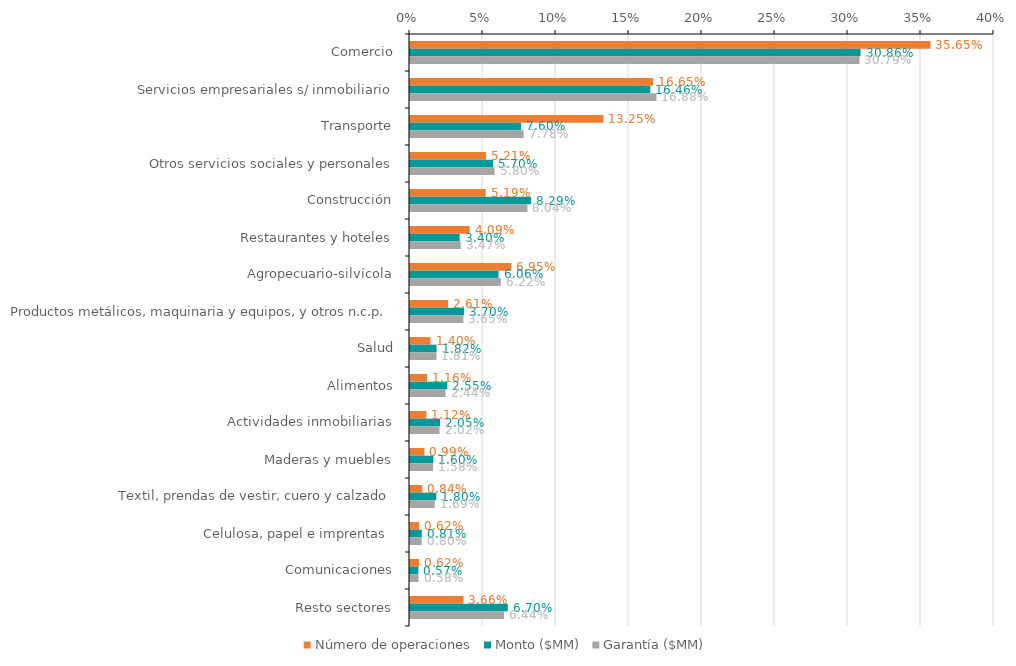
| Category | Número de operaciones | Monto ($MM) | Garantía ($MM) |
|---|---|---|---|
| Comercio | 0.356 | 0.309 | 0.308 |
| Servicios empresariales s/ inmobiliario | 0.166 | 0.165 | 0.169 |
| Transporte | 0.132 | 0.076 | 0.078 |
| Otros servicios sociales y personales | 0.052 | 0.057 | 0.058 |
| Construcción | 0.052 | 0.083 | 0.08 |
| Restaurantes y hoteles | 0.041 | 0.034 | 0.035 |
| Agropecuario-silvícola | 0.069 | 0.061 | 0.062 |
| Productos metálicos, maquinaria y equipos, y otros n.c.p. | 0.026 | 0.037 | 0.037 |
| Salud | 0.014 | 0.018 | 0.018 |
| Alimentos | 0.012 | 0.026 | 0.024 |
| Actividades inmobiliarias | 0.011 | 0.021 | 0.02 |
| Maderas y muebles | 0.01 | 0.016 | 0.016 |
| Textil, prendas de vestir, cuero y calzado | 0.008 | 0.018 | 0.017 |
| Celulosa, papel e imprentas  | 0.006 | 0.008 | 0.008 |
| Comunicaciones | 0.006 | 0.006 | 0.006 |
| Resto sectores | 0.037 | 0.067 | 0.064 |